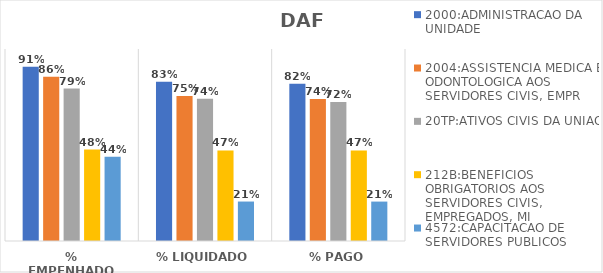
| Category | 2000:ADMINISTRACAO DA UNIDADE | 2004:ASSISTENCIA MEDICA E ODONTOLOGICA AOS SERVIDORES CIVIS, EMPR | 20TP:ATIVOS CIVIS DA UNIAO | 212B:BENEFICIOS OBRIGATORIOS AOS SERVIDORES CIVIS, EMPREGADOS, MI | 4572:CAPACITACAO DE SERVIDORES PUBLICOS FEDERAIS EM PROCESSO DE Q |
|---|---|---|---|---|---|
| % EMPENHADO | 0.907 | 0.856 | 0.794 | 0.476 | 0.438 |
| % LIQUIDADO | 0.83 | 0.755 | 0.741 | 0.472 | 0.205 |
| % PAGO | 0.818 | 0.74 | 0.724 | 0.472 | 0.205 |